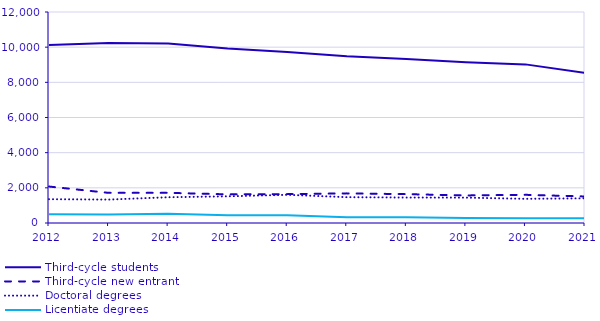
| Category | Third-cycle students | Third-cycle new entrants | Doctoral degrees | Licentiate degrees |
|---|---|---|---|---|
| 2012.0 | 10119 | 2074 | 1354 | 501 |
| 2013.0 | 10240 | 1714 | 1332 | 482 |
| 2014.0 | 10208 | 1716 | 1465 | 529 |
| 2015.0 | 9922 | 1629 | 1517 | 445 |
| 2016.0 | 9727 | 1642 | 1603 | 435 |
| 2017.0 | 9485 | 1685 | 1469 | 322 |
| 2018.0 | 9332 | 1641 | 1448 | 320 |
| 2019.0 | 9144 | 1568 | 1442 | 288 |
| 2020.0 | 9021 | 1603 | 1375 | 272 |
| 2021.0 | 8538 | 1509 | 1404 | 271 |